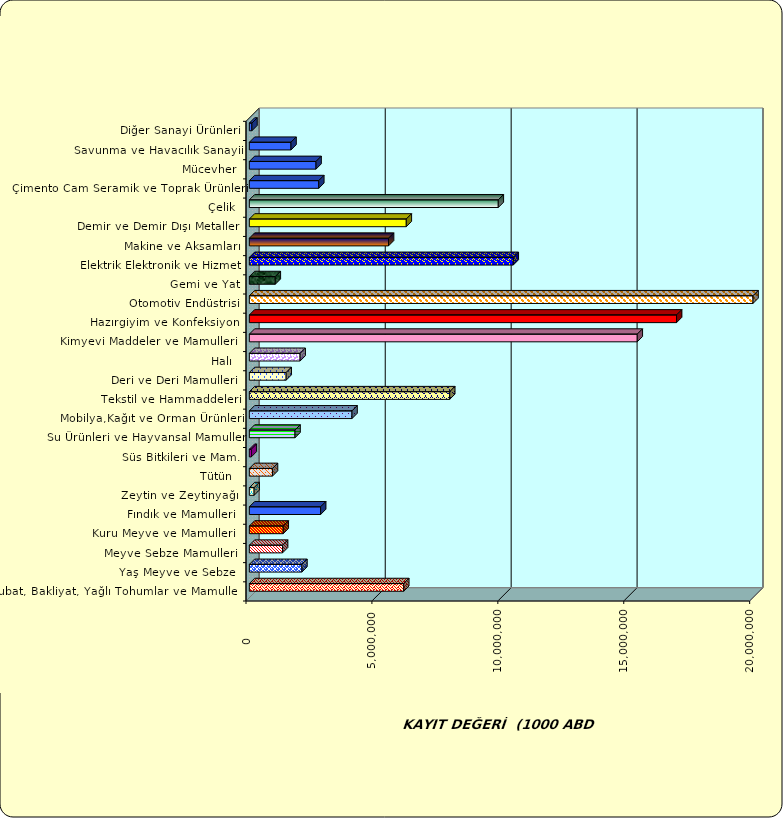
| Category | Series 0 |
|---|---|
|  Hububat, Bakliyat, Yağlı Tohumlar ve Mamulleri  | 6130825.773 |
|  Yaş Meyve ve Sebze   | 2086574.568 |
|  Meyve Sebze Mamulleri  | 1319294.36 |
|  Kuru Meyve ve Mamulleri   | 1345894.972 |
|  Fındık ve Mamulleri  | 2830691.47 |
|  Zeytin ve Zeytinyağı  | 189490.951 |
|  Tütün  | 918338.628 |
|  Süs Bitkileri ve Mam. | 77665.93 |
|  Su Ürünleri ve Hayvansal Mamuller | 1813671.993 |
|  Mobilya,Kağıt ve Orman Ürünleri | 4076041.197 |
|  Tekstil ve Hammaddeleri | 7955781.486 |
|  Deri ve Deri Mamulleri  | 1461668.554 |
|  Halı  | 2015997.849 |
|  Kimyevi Maddeler ve Mamulleri   | 15403245.201 |
|  Hazırgiyim ve Konfeksiyon  | 16964653.54 |
|  Otomotiv Endüstrisi | 21153355.019 |
|  Gemi ve Yat | 1029863.158 |
|  Elektrik Elektronik ve Hizmet | 10479146.442 |
|  Makine ve Aksamları | 5526795.897 |
|  Demir ve Demir Dışı Metaller  | 6231979.778 |
|  Çelik | 9884953.525 |
|  Çimento Cam Seramik ve Toprak Ürünleri | 2756552.736 |
|  Mücevher | 2648255.947 |
|  Savunma ve Havacılık Sanayii | 1654168.998 |
|  Diğer Sanayi Ürünleri | 101317.036 |